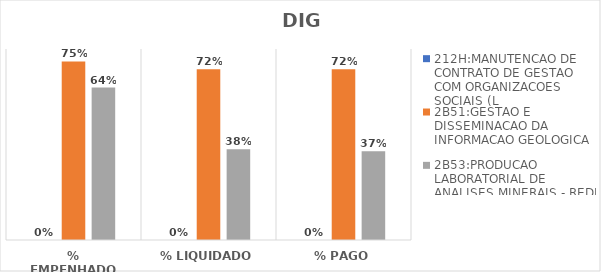
| Category | 212H:MANUTENCAO DE CONTRATO DE GESTAO COM ORGANIZACOES SOCIAIS (L | 2B51:GESTAO E DISSEMINACAO DA INFORMACAO GEOLOGICA | 2B53:PRODUCAO LABORATORIAL DE ANALISES MINERAIS - REDE LAMIN |
|---|---|---|---|
| % EMPENHADO | 0 | 0.748 | 0.638 |
| % LIQUIDADO | 0 | 0.715 | 0.38 |
| % PAGO | 0 | 0.715 | 0.371 |